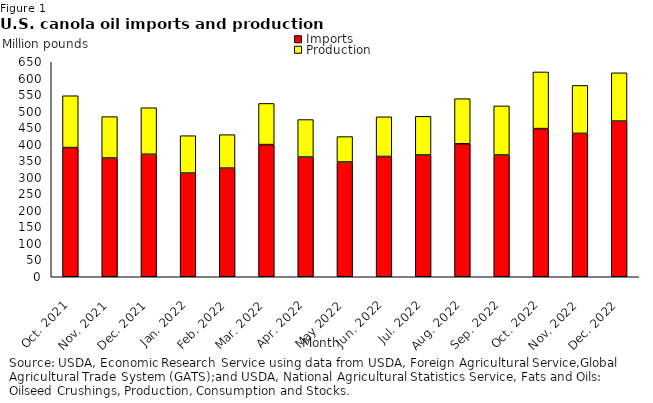
| Category | Imports | Production |
|---|---|---|
| Oct. 2021 | 390.613 | 156.615 |
| Nov. 2021 | 358.958 | 125.126 |
| Dec. 2021 | 370.307 | 140.696 |
| Jan. 2022 | 313.49 | 113.003 |
| Feb. 2022 | 328.484 | 101.075 |
| Mar. 2022 | 399.579 | 124.427 |
| Apr. 2022 | 361.95 | 113.295 |
| May 2022 | 346.913 | 76.861 |
| Jun. 2022 | 363.579 | 119.992 |
| Jul. 2022 | 368.116 | 116.874 |
| Aug. 2022 | 401.902 | 136.548 |
| Sep. 2022 | 368.094 | 148.457 |
| Oct. 2022 | 447.873 | 171.282 |
| Nov. 2022 | 433.458 | 144.969 |
| Dec. 2022 | 470.654 | 145.914 |